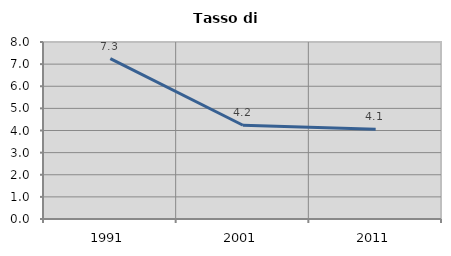
| Category | Tasso di disoccupazione   |
|---|---|
| 1991.0 | 7.252 |
| 2001.0 | 4.238 |
| 2011.0 | 4.054 |